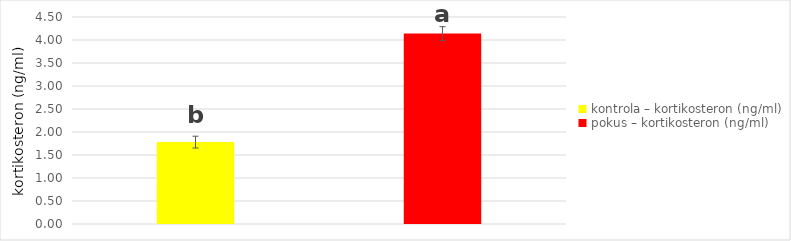
| Category | Series 0 |
|---|---|
| kontrola – kortikosteron (ng/ml) | 1.78 |
| pokus – kortikosteron (ng/ml) | 4.14 |